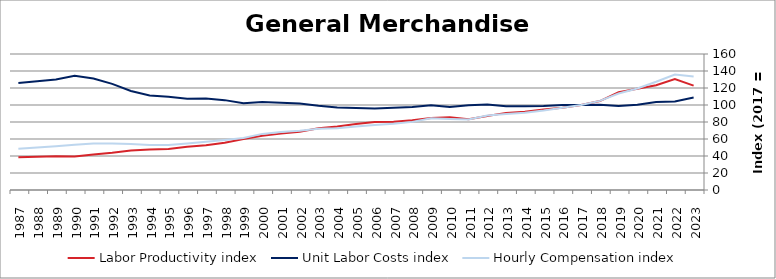
| Category | Labor Productivity index | Unit Labor Costs index | Hourly Compensation index |
|---|---|---|---|
| 2023.0 | 122.768 | 108.831 | 133.61 |
| 2022.0 | 130.42 | 104.217 | 135.92 |
| 2021.0 | 123.158 | 103.404 | 127.351 |
| 2020.0 | 119.011 | 100.319 | 119.391 |
| 2019.0 | 115.032 | 98.747 | 113.59 |
| 2018.0 | 104.596 | 100.227 | 104.834 |
| 2017.0 | 100 | 100 | 100 |
| 2016.0 | 96.682 | 100.106 | 96.785 |
| 2015.0 | 94.686 | 98.749 | 93.502 |
| 2014.0 | 92.06 | 98.63 | 90.799 |
| 2013.0 | 90.733 | 98.45 | 89.327 |
| 2012.0 | 87.182 | 100.669 | 87.765 |
| 2011.0 | 83.29 | 99.646 | 82.995 |
| 2010.0 | 85.579 | 97.61 | 83.534 |
| 2009.0 | 84.698 | 99.609 | 84.367 |
| 2008.0 | 82.179 | 97.532 | 80.151 |
| 2007.0 | 80.323 | 96.891 | 77.825 |
| 2006.0 | 79.93 | 95.807 | 76.578 |
| 2005.0 | 77.558 | 96.418 | 74.78 |
| 2004.0 | 74.82 | 97.091 | 72.644 |
| 2003.0 | 72.73 | 99.111 | 72.084 |
| 2002.0 | 68.565 | 101.688 | 69.722 |
| 2001.0 | 66.323 | 102.767 | 68.158 |
| 2000.0 | 63.71 | 103.625 | 66.019 |
| 1999.0 | 60.019 | 101.933 | 61.179 |
| 1998.0 | 55.679 | 105.73 | 58.869 |
| 1997.0 | 52.772 | 107.739 | 56.856 |
| 1996.0 | 50.932 | 107.335 | 54.668 |
| 1995.0 | 48.259 | 109.645 | 52.913 |
| 1994.0 | 47.629 | 111.262 | 52.993 |
| 1993.0 | 46.486 | 116.509 | 54.161 |
| 1992.0 | 43.752 | 124.852 | 54.625 |
| 1991.0 | 41.698 | 131.192 | 54.704 |
| 1990.0 | 39.55 | 134.265 | 53.101 |
| 1989.0 | 39.697 | 129.94 | 51.583 |
| 1988.0 | 38.989 | 128.062 | 49.93 |
| 1987.0 | 38.634 | 125.877 | 48.631 |